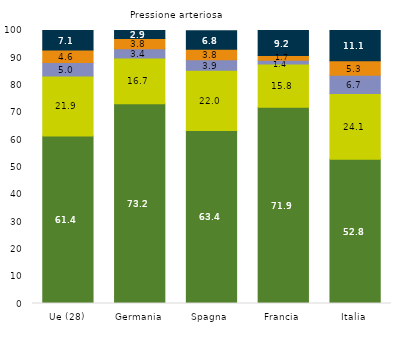
| Category | Meno di un anno | Da 1 a 3 anni | Da 3 a 5 anni | 5 anni e più | Mai |
|---|---|---|---|---|---|
| Ue (28) | 61.4 | 21.9 | 5 | 4.6 | 7.1 |
| Germania | 73.2 | 16.7 | 3.4 | 3.8 | 2.9 |
| Spagna | 63.4 | 22 | 3.9 | 3.8 | 6.8 |
| Francia | 71.9 | 15.8 | 1.4 | 1.7 | 9.2 |
| Italia | 52.8 | 24.1 | 6.7 | 5.3 | 11.1 |